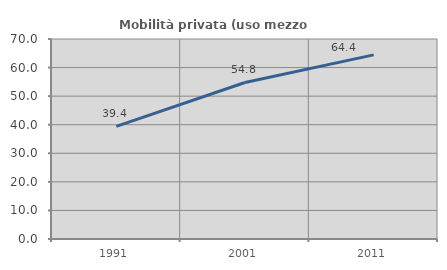
| Category | Mobilità privata (uso mezzo privato) |
|---|---|
| 1991.0 | 39.44 |
| 2001.0 | 54.785 |
| 2011.0 | 64.442 |